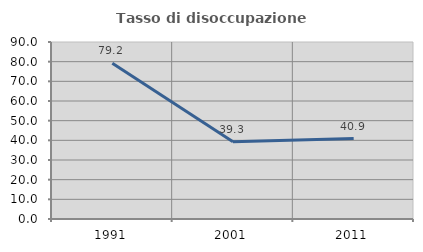
| Category | Tasso di disoccupazione giovanile  |
|---|---|
| 1991.0 | 79.212 |
| 2001.0 | 39.252 |
| 2011.0 | 40.928 |